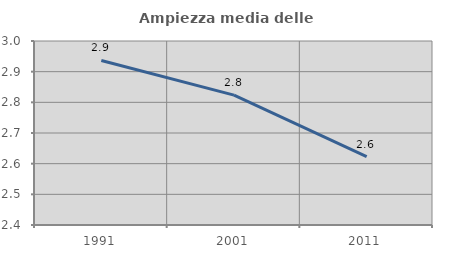
| Category | Ampiezza media delle famiglie |
|---|---|
| 1991.0 | 2.937 |
| 2001.0 | 2.823 |
| 2011.0 | 2.623 |